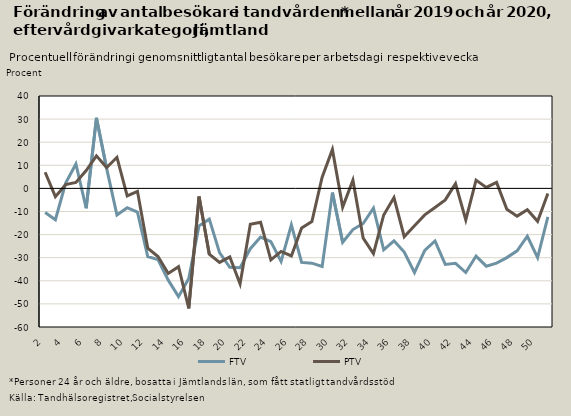
| Category | FTV | PTV |
|---|---|---|
| 2.0 | -10.462 | 6.986 |
| 3.0 | -13.55 | -3.569 |
| 4.0 | 2.323 | 1.623 |
| 5.0 | 10.573 | 2.567 |
| 6.0 | -8.597 | 7.724 |
| 7.0 | 30.556 | 14.103 |
| 8.0 | 8.547 | 9.05 |
| 9.0 | -11.504 | 13.475 |
| 10.0 | -8.344 | -3.257 |
| 11.0 | -10.238 | -1.26 |
| 12.0 | -29.467 | -25.843 |
| 13.0 | -30.851 | -29.499 |
| 14.0 | -39.726 | -36.8 |
| 15.0 | -46.853 | -33.898 |
| 16.0 | -38.978 | -51.974 |
| 17.0 | -16.197 | -3.527 |
| 18.0 | -13.313 | -28.484 |
| 19.0 | -27.778 | -32.036 |
| 20.0 | -34.144 | -29.688 |
| 21.0 | -34.346 | -41.35 |
| 22.0 | -26.116 | -15.563 |
| 23.0 | -21.047 | -14.623 |
| 24.0 | -23.041 | -30.945 |
| 25.0 | -31.579 | -27.279 |
| 26.0 | -15.756 | -29.222 |
| 27.0 | -32.05 | -17.156 |
| 28.0 | -32.358 | -14.348 |
| 29.0 | -33.793 | 4.878 |
| 30.0 | -1.818 | 16.854 |
| 31.0 | -23.301 | -8.108 |
| 32.0 | -17.822 | 3.586 |
| 33.0 | -15.182 | -21.535 |
| 34.0 | -8.576 | -28.219 |
| 35.0 | -26.587 | -11.498 |
| 36.0 | -22.674 | -3.965 |
| 37.0 | -27.574 | -20.921 |
| 38.0 | -36.423 | -16.135 |
| 39.0 | -26.788 | -11.47 |
| 40.0 | -22.748 | -8.287 |
| 41.0 | -32.927 | -4.956 |
| 42.0 | -32.448 | 2.083 |
| 43.0 | -36.419 | -13.65 |
| 44.0 | -29.289 | 3.584 |
| 45.0 | -33.675 | 0.413 |
| 46.0 | -32.321 | 2.62 |
| 47.0 | -29.963 | -9.053 |
| 48.0 | -27.017 | -12.005 |
| 49.0 | -20.708 | -9.233 |
| 50.0 | -30 | -14.254 |
| 51.0 | -12.295 | -2.224 |